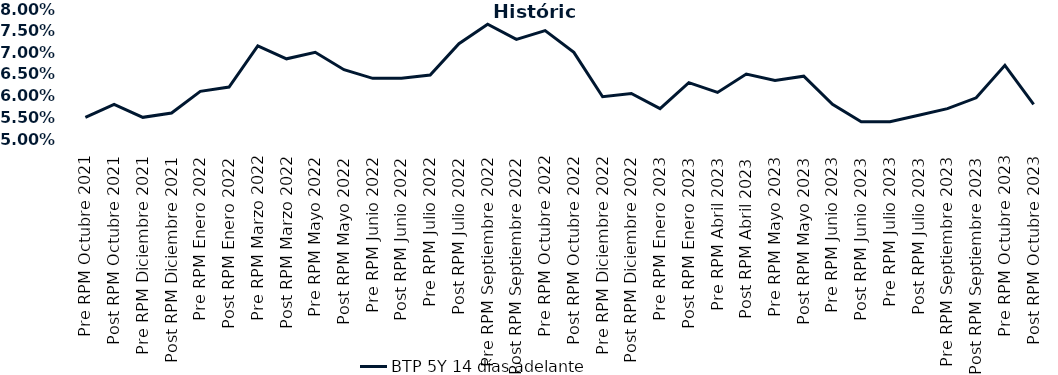
| Category | BTP 5Y 14 días adelante |
|---|---|
| Pre RPM Octubre 2021 | 0.055 |
| Post RPM Octubre 2021 | 0.058 |
| Pre RPM Diciembre 2021 | 0.055 |
| Post RPM Diciembre 2021 | 0.056 |
| Pre RPM Enero 2022 | 0.061 |
| Post RPM Enero 2022 | 0.062 |
| Pre RPM Marzo 2022 | 0.072 |
| Post RPM Marzo 2022 | 0.068 |
| Pre RPM Mayo 2022 | 0.07 |
| Post RPM Mayo 2022 | 0.066 |
| Pre RPM Junio 2022 | 0.064 |
| Post RPM Junio 2022 | 0.064 |
| Pre RPM Julio 2022 | 0.065 |
| Post RPM Julio 2022 | 0.072 |
| Pre RPM Septiembre 2022 | 0.076 |
| Post RPM Septiembre 2022 | 0.073 |
| Pre RPM Octubre 2022 | 0.075 |
| Post RPM Octubre 2022 | 0.07 |
| Pre RPM Diciembre 2022 | 0.06 |
| Post RPM Diciembre 2022 | 0.06 |
| Pre RPM Enero 2023 | 0.057 |
| Post RPM Enero 2023 | 0.063 |
| Pre RPM Abril 2023 | 0.061 |
| Post RPM Abril 2023 | 0.065 |
| Pre RPM Mayo 2023 | 0.064 |
| Post RPM Mayo 2023 | 0.064 |
| Pre RPM Junio 2023 | 0.058 |
| Post RPM Junio 2023 | 0.054 |
| Pre RPM Julio 2023 | 0.054 |
| Post RPM Julio 2023 | 0.056 |
| Pre RPM Septiembre 2023 | 0.057 |
| Post RPM Septiembre 2023 | 0.06 |
| Pre RPM Octubre 2023 | 0.067 |
| Post RPM Octubre 2023 | 0.058 |